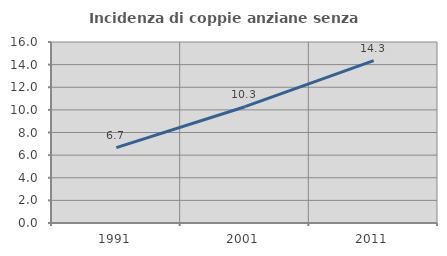
| Category | Incidenza di coppie anziane senza figli  |
|---|---|
| 1991.0 | 6.667 |
| 2001.0 | 10.28 |
| 2011.0 | 14.35 |